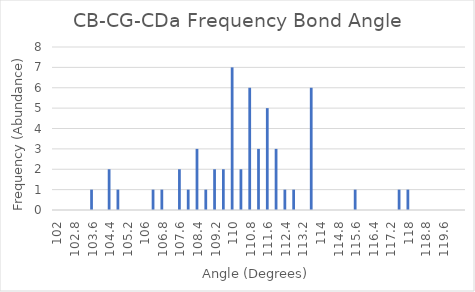
| Category | Series 0 |
|---|---|
| 102.0 | 0 |
| 102.4 | 0 |
| 102.80000000000001 | 0 |
| 103.20000000000002 | 0 |
| 103.60000000000002 | 1 |
| 104.00000000000003 | 0 |
| 104.40000000000003 | 2 |
| 104.80000000000004 | 1 |
| 105.20000000000005 | 0 |
| 105.60000000000005 | 0 |
| 106.00000000000006 | 0 |
| 106.40000000000006 | 1 |
| 106.80000000000007 | 1 |
| 107.20000000000007 | 0 |
| 107.60000000000008 | 2 |
| 108.00000000000009 | 1 |
| 108.40000000000009 | 3 |
| 108.8000000000001 | 1 |
| 109.2000000000001 | 2 |
| 109.60000000000011 | 2 |
| 110.00000000000011 | 7 |
| 110.40000000000012 | 2 |
| 110.80000000000013 | 6 |
| 111.20000000000013 | 3 |
| 111.60000000000014 | 5 |
| 112.00000000000014 | 3 |
| 112.40000000000015 | 1 |
| 112.80000000000015 | 1 |
| 113.20000000000016 | 0 |
| 113.60000000000016 | 6 |
| 114.00000000000017 | 0 |
| 114.40000000000018 | 0 |
| 114.80000000000018 | 0 |
| 115.20000000000019 | 0 |
| 115.6000000000002 | 1 |
| 116.0000000000002 | 0 |
| 116.4000000000002 | 0 |
| 116.80000000000021 | 0 |
| 117.20000000000022 | 0 |
| 117.60000000000022 | 1 |
| 118.00000000000023 | 1 |
| 118.40000000000023 | 0 |
| 118.80000000000024 | 0 |
| 119.20000000000024 | 0 |
| 119.60000000000025 | 0 |
| 120.00000000000026 | 0 |